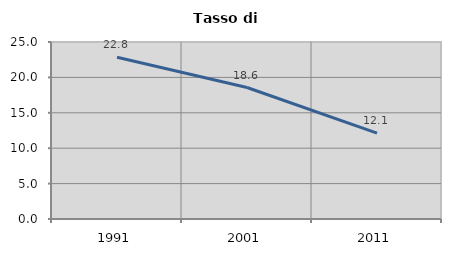
| Category | Tasso di disoccupazione   |
|---|---|
| 1991.0 | 22.842 |
| 2001.0 | 18.57 |
| 2011.0 | 12.133 |